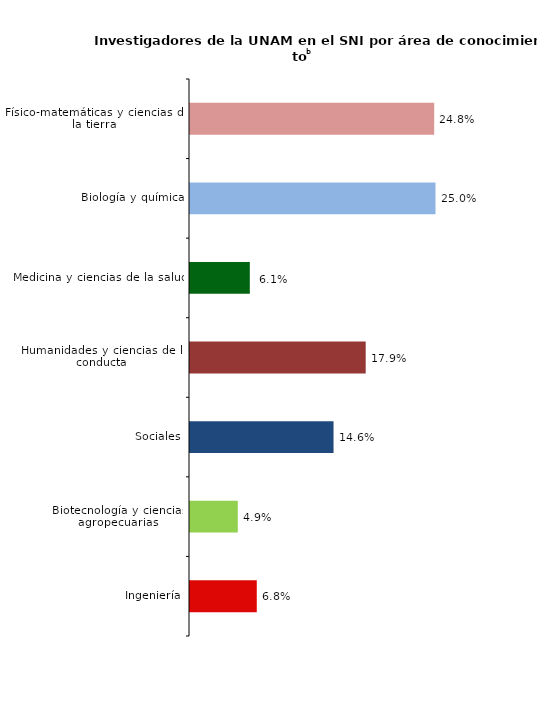
| Category | Series 0 |
|---|---|
| Ingeniería | 0.068 |
| Biotecnología y ciencias agropecuarias | 0.049 |
| Sociales | 0.146 |
| Humanidades y ciencias de la conducta | 0.179 |
| Medicina y ciencias de la salud | 0.061 |
| Biología y química | 0.25 |
| Físico-matemáticas y ciencias de la tierra | 0.248 |